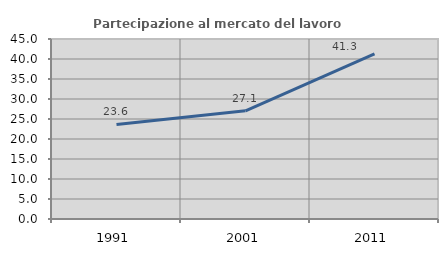
| Category | Partecipazione al mercato del lavoro  femminile |
|---|---|
| 1991.0 | 23.645 |
| 2001.0 | 27.053 |
| 2011.0 | 41.284 |